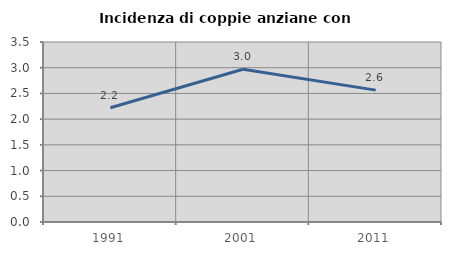
| Category | Incidenza di coppie anziane con figli |
|---|---|
| 1991.0 | 2.222 |
| 2001.0 | 2.97 |
| 2011.0 | 2.564 |